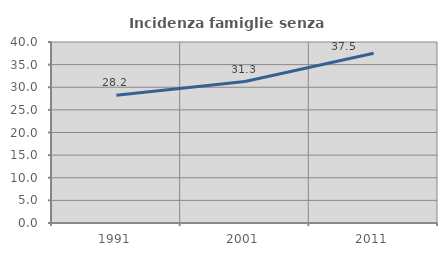
| Category | Incidenza famiglie senza nuclei |
|---|---|
| 1991.0 | 28.238 |
| 2001.0 | 31.264 |
| 2011.0 | 37.526 |